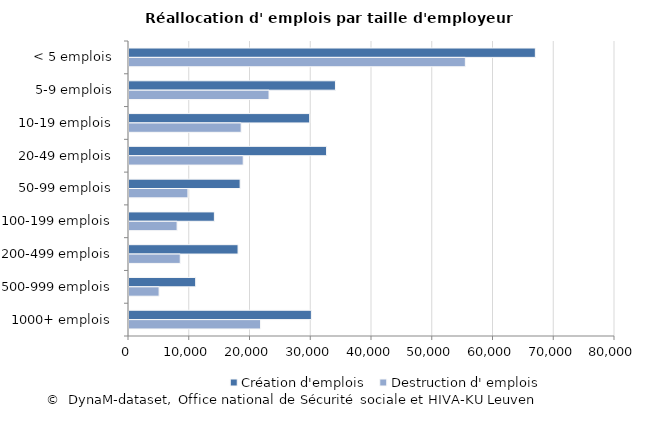
| Category | Création d'emplois | Destruction d' emplois |
|---|---|---|
| < 5 emplois | 66888 | 55366 |
| 5-9 emplois | 33986 | 23048 |
| 10-19 emplois | 29745 | 18462 |
| 20-49 emplois | 32521 | 18800 |
| 50-99 emplois | 18293 | 9701 |
| 100-199 emplois | 14056 | 7919 |
| 200-499 emplois | 17952 | 8434 |
| 500-999 emplois | 10976 | 4956 |
| 1000+ emplois | 30021 | 21658 |